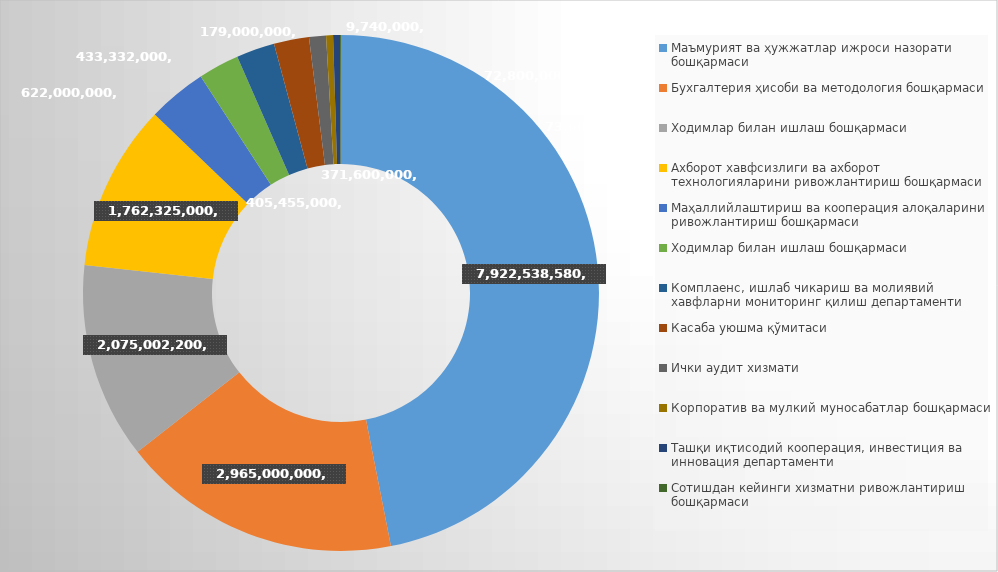
| Category | Жами |
|---|---|
| Маъмурият ва ҳужжатлар ижроси назорати бошқармаси | 7922538580 |
| Бухгалтерия ҳисоби ва методология бошқармаси | 2965000000 |
| Ходимлар билан ишлаш бошқармаси | 2075002200 |
| Ахборот хавфсизлиги ва ахборот технологияларини ривожлантириш бошқармаси | 1762325000 |
| Маҳаллийлаштириш ва кооперация алоқаларини ривожлантириш бошқармаси | 622000000 |
| Ходимлар билан ишлаш бошқармаси | 433332000 |
| Комплаенс, ишлаб чикариш ва молиявий хавфларни мониторинг қилиш департаменти | 405455000 |
| Касаба уюшма қўмитаси | 371600000 |
| Ички аудит хизмати | 179000000 |
| Корпоратив ва мулкий муносабатлар бошқармаси | 73600000 |
| Ташқи иқтисодий кооперация, инвестиция ва инновация департаменти | 72800000 |
| Сотишдан кейинги хизматни ривожлантириш бошқармаси | 9740000 |